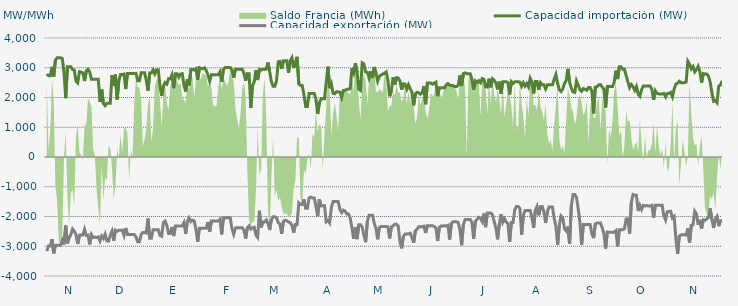
| Category | Capacidad importación (MW) | Capacidad exportación (MW) |
|---|---|---|
| 0 | 2787.5 | -3162.5 |
| 1900-01-01 | 2733.333 | -2987.5 |
| 1900-01-02 | 2733.333 | -2987.5 |
| 1900-01-03 | 3029.167 | -2762.5 |
| 1900-01-04 | 2695.833 | -3239.583 |
| 1900-01-05 | 3258.333 | -2966.667 |
| 1900-01-06 | 3333.333 | -2966.667 |
| 1900-01-07 | 3333.333 | -2966.667 |
| 1900-01-08 | 3333.333 | -2966.667 |
| 1900-01-09 | 3312.5 | -2793.75 |
| 1900-01-10 | 2843.75 | -2937.5 |
| 1900-01-11 | 1977.083 | -2306.25 |
| 1900-01-12 | 3033.333 | -2904.167 |
| 1900-01-13 | 3033.333 | -2710.417 |
| 1900-01-14 | 3033.333 | -2608.333 |
| 1900-01-15 | 2939.583 | -2420.833 |
| 1900-01-16 | 2920.833 | -2495.833 |
| 1900-01-17 | 2550 | -2612.5 |
| 1900-01-18 | 2491.667 | -2922.917 |
| 1900-01-19 | 2866.667 | -2629.167 |
| 1900-01-20 | 2854.167 | -2618.75 |
| 1900-01-21 | 2825 | -2622.917 |
| 1900-01-22 | 2554.167 | -2429.167 |
| 1900-01-23 | 2891.667 | -2635.417 |
| 1900-01-24 | 2950 | -2622.917 |
| 1900-01-25 | 2858.333 | -2937.5 |
| 1900-01-26 | 2616.667 | -2608.333 |
| 1900-01-27 | 2616.667 | -2708.333 |
| 1900-01-28 | 2616.667 | -2691.667 |
| 1900-01-29 | 2616.667 | -2708.333 |
| 1900-01-30 | 2616.667 | -2683.333 |
| 1900-01-31 | 1850 | -2820.833 |
| 1900-02-01 | 2268.75 | -2658.333 |
| 1900-02-02 | 1795.833 | -2741.667 |
| 1900-02-03 | 1725 | -2595.833 |
| 1900-02-04 | 1808.333 | -2825 |
| 1900-02-05 | 1808.333 | -2829.167 |
| 1900-02-06 | 1808.333 | -2622.917 |
| 1900-02-07 | 2750 | -2491.667 |
| 1900-02-08 | 2385.417 | -2816.667 |
| 1900-02-09 | 2770.833 | -2458.333 |
| 1900-02-10 | 1937.5 | -2495.833 |
| 1900-02-11 | 2562.5 | -2458.333 |
| 1900-02-12 | 2770.833 | -2458.333 |
| 1900-02-13 | 2770.833 | -2458.333 |
| 1900-02-14 | 2787.5 | -2637.5 |
| 1900-02-15 | 2283.333 | -2387.5 |
| 1900-02-16 | 2808.333 | -2606.25 |
| 1900-02-17 | 2808.333 | -2606.25 |
| 1900-02-18 | 2808.333 | -2606.25 |
| 1900-02-19 | 2808.333 | -2606.25 |
| 1900-02-20 | 2808.333 | -2606.25 |
| 1900-02-21 | 2812.5 | -2687.5 |
| 1900-02-22 | 2562.5 | -2847.917 |
| 1900-02-23 | 2562.5 | -2847.917 |
| 1900-02-24 | 2833.333 | -2606.25 |
| 1900-02-25 | 2833.333 | -2535.417 |
| 1900-02-26 | 2833.333 | -2535.417 |
| 1900-02-27 | 2587.5 | -2556.25 |
| 1900-02-28 | 2229.167 | -2068.75 |
| 1900-02-28 | 2825 | -2729.167 |
| 1900-03-01 | 2825 | -2729.167 |
| 1900-03-02 | 2933.333 | -2441.667 |
| 1900-03-03 | 2795.833 | -2441.667 |
| 1900-03-04 | 2933.333 | -2441.667 |
| 1900-03-05 | 2933.333 | -2441.667 |
| 1900-03-06 | 2397.917 | -2637.5 |
| 1900-03-07 | 2056.25 | -2662.5 |
| 1900-03-08 | 2383.333 | -2202.083 |
| 1900-03-09 | 2500 | -2154.167 |
| 1900-03-10 | 2450 | -2293.75 |
| 1900-03-11 | 2633.333 | -2570.833 |
| 1900-03-12 | 2633.333 | -2570.833 |
| 1900-03-13 | 2762.5 | -2352.083 |
| 1900-03-14 | 2312.5 | -2656.25 |
| 1900-03-15 | 2800 | -2322.917 |
| 1900-03-16 | 2800 | -2322.917 |
| 1900-03-17 | 2683.333 | -2322.917 |
| 1900-03-18 | 2787.5 | -2322.917 |
| 1900-03-19 | 2800 | -2322.917 |
| 1900-03-20 | 2412.5 | -2206.25 |
| 1900-03-21 | 2200 | -2575 |
| 1900-03-22 | 2616.667 | -2170.833 |
| 1900-03-23 | 2404.167 | -2045.833 |
| 1900-03-24 | 2937.5 | -2170.833 |
| 1900-03-25 | 2941.667 | -2125 |
| 1900-03-26 | 2925 | -2145.833 |
| 1900-03-27 | 2968.75 | -2437.5 |
| 1900-03-28 | 2593.75 | -2854.167 |
| 1900-03-29 | 3000 | -2395.833 |
| 1900-03-30 | 2979.167 | -2395.833 |
| 1900-03-31 | 2964.583 | -2395.833 |
| 1900-04-01 | 3000 | -2395.833 |
| 1900-04-02 | 2906.25 | -2395.833 |
| 1900-04-03 | 2750 | -2187.5 |
| 1900-04-04 | 2550 | -2512.5 |
| 1900-04-05 | 2766.667 | -2154.167 |
| 1900-04-06 | 2766.667 | -2154.167 |
| 1900-04-07 | 2766.667 | -2154.167 |
| 1900-04-08 | 2766.667 | -2154.167 |
| 1900-04-09 | 2766.667 | -2154.167 |
| 1900-04-10 | 2862.5 | -2093.75 |
| 1900-04-11 | 2529.167 | -2604.167 |
| 1900-04-12 | 2945.833 | -2041.667 |
| 1900-04-13 | 3008.333 | -2041.667 |
| 1900-04-14 | 3008.333 | -2041.667 |
| 1900-04-15 | 3008.333 | -2041.667 |
| 1900-04-16 | 3008.333 | -2041.667 |
| 1900-04-17 | 2922.917 | -2412.5 |
| 1900-04-18 | 2662.5 | -2600 |
| 1900-04-19 | 2945.833 | -2389.583 |
| 1900-04-20 | 2945.833 | -2377.083 |
| 1900-04-21 | 2945.833 | -2377.083 |
| 1900-04-22 | 2945.833 | -2377.083 |
| 1900-04-23 | 2945.833 | -2379.167 |
| 1900-04-24 | 2812.5 | -2462.5 |
| 1900-04-25 | 2562.5 | -2741.667 |
| 1900-04-26 | 2802.083 | -2377.083 |
| 1900-04-27 | 2800 | -2312.5 |
| 1900-04-28 | 1650 | -2420.833 |
| 1900-04-29 | 2400 | -2379.167 |
| 1900-04-30 | 2533.333 | -2362.5 |
| 1900-05-01 | 2918.75 | -2622.917 |
| 1900-05-02 | 2587.5 | -2702.083 |
| 1900-05-03 | 2947.917 | -1808.333 |
| 1900-05-04 | 2922.917 | -2372.917 |
| 1900-05-05 | 2947.917 | -2181.25 |
| 1900-05-06 | 2947.917 | -2181.25 |
| 1900-05-07 | 2947.917 | -2114.583 |
| 1900-05-08 | 3175 | -2225 |
| 1900-05-09 | 2875 | -2454.167 |
| 1900-05-10 | 2535.417 | -2108.333 |
| 1900-05-11 | 2375 | -2012.5 |
| 1900-05-12 | 2375 | -2012.5 |
| 1900-05-13 | 2566.667 | -2043.75 |
| 1900-05-14 | 3200 | -2208.333 |
| 1900-05-15 | 3212.5 | -2250 |
| 1900-05-16 | 2962.5 | -2579.167 |
| 1900-05-17 | 3233.333 | -2166.667 |
| 1900-05-18 | 3233.333 | -2122.917 |
| 1900-05-19 | 3233.333 | -2145.833 |
| 1900-05-20 | 2829.167 | -2185.417 |
| 1900-05-21 | 3233.333 | -2208.333 |
| 1900-05-22 | 3337.5 | -2293.75 |
| 1900-05-23 | 2991.304 | -2541.304 |
| 1900-05-24 | 3183.333 | -2268.75 |
| 1900-05-25 | 3366.667 | -2268.75 |
| 1900-05-26 | 2454.583 | -1541.667 |
| 1900-05-27 | 2400 | -1600 |
| 1900-05-28 | 2400 | -1600 |
| 1900-05-29 | 2100 | -1425 |
| 1900-05-30 | 1700 | -1725 |
| 1900-05-31 | 1700 | -1725 |
| 1900-06-01 | 2133.333 | -1375 |
| 1900-06-02 | 2133.333 | -1350 |
| 1900-06-03 | 2133.333 | -1375 |
| 1900-06-04 | 2133.333 | -1375 |
| 1900-06-05 | 1943.75 | -1662.5 |
| 1900-06-06 | 1447.917 | -1991.667 |
| 1900-06-07 | 1820.833 | -1420.833 |
| 1900-06-08 | 1958.333 | -1645.833 |
| 1900-06-09 | 1958.333 | -1637.5 |
| 1900-06-10 | 1958.333 | -1637.5 |
| 1900-06-11 | 2502.083 | -2177.083 |
| 1900-06-12 | 3037.5 | -2129.167 |
| 1900-06-13 | 2312.5 | -2216.667 |
| 1900-06-14 | 2456.25 | -1702.083 |
| 1900-06-15 | 2141.667 | -1497.917 |
| 1900-06-16 | 2125 | -1497.917 |
| 1900-06-17 | 2191.667 | -1497.917 |
| 1900-06-18 | 2191.667 | -1497.917 |
| 1900-06-19 | 2175 | -1766.667 |
| 1900-06-20 | 1997.917 | -1870.833 |
| 1900-06-21 | 2233.333 | -1787.5 |
| 1900-06-22 | 2241.667 | -1818.75 |
| 1900-06-23 | 2275 | -1914.583 |
| 1900-06-24 | 2275 | -1914.583 |
| 1900-06-25 | 2304.167 | -2052.083 |
| 1900-06-26 | 2979.167 | -2385.417 |
| 1900-06-27 | 2825 | -2752.083 |
| 1900-06-28 | 3154.167 | -2358.333 |
| 1900-06-29 | 2850 | -2760.417 |
| 1900-06-30 | 2285.417 | -2275 |
| 1900-07-01 | 2239.583 | -2275 |
| 1900-07-02 | 3162.5 | -2358.333 |
| 1900-07-03 | 3127.083 | -2631.25 |
| 1900-07-04 | 2858.333 | -2862.5 |
| 1900-07-05 | 2841.667 | -2166.667 |
| 1900-07-06 | 2656.25 | -1956.25 |
| 1900-07-07 | 2883.333 | -1956.25 |
| 1900-07-08 | 2656.25 | -1956.25 |
| 1900-07-09 | 3025 | -2229.167 |
| 1900-07-10 | 2831.25 | -2393.75 |
| 1900-07-11 | 2550.625 | -2766.667 |
| 1900-07-12 | 2710.417 | -2368.75 |
| 1900-07-13 | 2754.167 | -2337.5 |
| 1900-07-14 | 2791.667 | -2337.5 |
| 1900-07-15 | 2808.333 | -2337.5 |
| 1900-07-16 | 2858.333 | -2337.5 |
| 1900-07-17 | 2581.25 | -2347.917 |
| 1900-07-18 | 2041.667 | -2737.5 |
| 1900-07-19 | 2218.75 | -2354.167 |
| 1900-07-20 | 2679.167 | -2320.833 |
| 1900-07-21 | 2427.083 | -2260.417 |
| 1900-07-22 | 2666.667 | -2260.417 |
| 1900-07-23 | 2654.167 | -2320.833 |
| 1900-07-24 | 2562.5 | -2837.5 |
| 1900-07-25 | 2264.583 | -3070.833 |
| 1900-07-26 | 2458.333 | -2672.917 |
| 1900-07-27 | 2454.167 | -2585.417 |
| 1900-07-28 | 2279.167 | -2585.417 |
| 1900-07-29 | 2431.25 | -2585.417 |
| 1900-07-30 | 2295.833 | -2562.5 |
| 1900-07-31 | 2181.25 | -2700 |
| 1900-08-01 | 1735.417 | -2883.333 |
| 1900-08-02 | 2125 | -2487.5 |
| 1900-08-03 | 2170.833 | -2429.167 |
| 1900-08-04 | 2158.333 | -2341.667 |
| 1900-08-05 | 2112.5 | -2341.667 |
| 1900-08-06 | 2158.333 | -2341.667 |
| 1900-08-07 | 2383.333 | -2325 |
| 1900-08-08 | 1772.917 | -2554.167 |
| 1900-08-09 | 2485.417 | -2308.333 |
| 1900-08-10 | 2485.417 | -2308.333 |
| 1900-08-11 | 2485.417 | -2308.333 |
| 1900-08-12 | 2447.917 | -2308.333 |
| 1900-08-13 | 2485.417 | -2333.333 |
| 1900-08-14 | 2516.667 | -2387.5 |
| 1900-08-15 | 2043.75 | -2822.917 |
| 1900-08-16 | 2331.25 | -2362.5 |
| 1900-08-17 | 2331.25 | -2320.833 |
| 1900-08-18 | 2331.25 | -2320.833 |
| 1900-08-19 | 2318.75 | -2308.333 |
| 1900-08-20 | 2425 | -2320.833 |
| 1900-08-21 | 2468.75 | -2295.833 |
| 1900-08-22 | 2418.75 | -2772.917 |
| 1900-08-23 | 2400 | -2235.417 |
| 1900-08-24 | 2400 | -2179.167 |
| 1900-08-25 | 2366.667 | -2179.167 |
| 1900-08-26 | 2366.667 | -2179.167 |
| 1900-08-27 | 2404.167 | -2200 |
| 1900-08-28 | 2743.75 | -2437.5 |
| 1900-08-29 | 2393.75 | -2964.583 |
| 1900-08-30 | 2804.167 | -2270.833 |
| 1900-08-31 | 2829.167 | -2097.917 |
| 1900-09-01 | 2800 | -2097.917 |
| 1900-09-02 | 2800 | -2097.917 |
| 1900-09-03 | 2800 | -2097.917 |
| 1900-09-04 | 2610.417 | -2200 |
| 1900-09-05 | 2264.583 | -2750 |
| 1900-09-06 | 2556.25 | -2166.667 |
| 1900-09-07 | 2506.25 | -2095.833 |
| 1900-09-08 | 2564.583 | -2029.167 |
| 1900-09-09 | 2497.917 | -2058.333 |
| 1900-09-10 | 2635.417 | -2166.667 |
| 1900-09-11 | 2612.5 | -1900 |
| 1900-09-12 | 2362.5 | -2358.333 |
| 1900-09-13 | 2350 | -1885.417 |
| 1900-09-14 | 2633.333 | -1885.417 |
| 1900-09-15 | 2341.667 | -1885.417 |
| 1900-09-16 | 2633.333 | -1943.75 |
| 1900-09-17 | 2579.167 | -2168.75 |
| 1900-09-18 | 2485.417 | -2400 |
| 1900-09-19 | 2275 | -2766.667 |
| 1900-09-20 | 2533.333 | -2252.083 |
| 1900-09-21 | 2125 | -1929.167 |
| 1900-09-22 | 2533.333 | -2195.833 |
| 1900-09-23 | 2533.333 | -2072.917 |
| 1900-09-24 | 2533.333 | -2187.5 |
| 1900-09-25 | 2500 | -2237.5 |
| 1900-09-26 | 2100 | -2856.25 |
| 1900-09-27 | 2533.333 | -2202.083 |
| 1900-09-28 | 2475 | -2202.083 |
| 1900-09-29 | 2533.333 | -1768.75 |
| 1900-09-30 | 2533.333 | -1662.5 |
| 1900-10-01 | 2533.333 | -1662.5 |
| 1900-10-02 | 2518.75 | -1725 |
| 1900-10-03 | 2375 | -2614.583 |
| 1900-10-04 | 2495.833 | -1964.583 |
| 1900-10-05 | 2383.333 | -1800 |
| 1900-10-06 | 2466.667 | -1800 |
| 1900-10-07 | 2358.333 | -1800 |
| 1900-10-08 | 2650 | -1800 |
| 1900-10-09 | 2525 | -2037.5 |
| 1900-10-10 | 2135.417 | -2381.25 |
| 1900-10-11 | 2537.5 | -1800 |
| 1900-10-12 | 2537.5 | -1662.5 |
| 1900-10-13 | 2260.417 | -1960.417 |
| 1900-10-14 | 2500 | -1662.5 |
| 1900-10-15 | 2425 | -1662.5 |
| 1900-10-16 | 2425 | -1843.75 |
| 1900-10-17 | 2287.5 | -2216.667 |
| 1900-10-18 | 2425 | -1843.75 |
| 1900-10-19 | 2425 | -1681.25 |
| 1900-10-20 | 2425 | -1681.25 |
| 1900-10-21 | 2425 | -1681.25 |
| 1900-10-22 | 2616.667 | -2062.5 |
| 1900-10-23 | 2775 | -2329.167 |
| 1900-10-24 | 2475 | -2956.25 |
| 1900-10-25 | 2258.333 | -2293.75 |
| 1900-10-26 | 2200 | -1981.25 |
| 1900-10-27 | 2283.333 | -2043.75 |
| 1900-10-28 | 2466.667 | -2410.417 |
| 1900-10-29 | 2570.833 | -2485.417 |
| 1900-10-30 | 2962.5 | -2341.667 |
| 1900-10-31 | 2512.5 | -2920.833 |
| 1900-11-01 | 2308.333 | -1650 |
| 1900-11-02 | 2187.5 | -1262.5 |
| 1900-11-03 | 2170.833 | -1262.5 |
| 1900-11-04 | 2558.333 | -1352.083 |
| 1900-11-05 | 2416.667 | -1731.25 |
| 1900-11-06 | 2266.667 | -2175 |
| 1900-11-07 | 2208.333 | -2956.25 |
| 1900-11-08 | 2300 | -2268.75 |
| 1900-11-09 | 2275 | -2266.667 |
| 1900-11-10 | 2241.667 | -2266.667 |
| 1900-11-11 | 2333.333 | -2266.667 |
| 1900-11-12 | 2333.333 | -2270.833 |
| 1900-11-13 | 2212.5 | -2581.25 |
| 1900-11-14 | 1464.583 | -2725 |
| 1900-11-15 | 2350 | -2250 |
| 1900-11-16 | 2358.333 | -2218.75 |
| 1900-11-17 | 2425 | -2218.75 |
| 1900-11-18 | 2433.333 | -2218.75 |
| 1900-11-19 | 2354.167 | -2368.75 |
| 1900-11-20 | 2279.167 | -2575 |
| 1900-11-21 | 1662.5 | -3079.167 |
| 1900-11-22 | 2366.667 | -2522.917 |
| 1900-11-23 | 2366.667 | -2527.083 |
| 1900-11-24 | 2366.667 | -2527.083 |
| 1900-11-25 | 2366.667 | -2527.083 |
| 1900-11-26 | 2508.333 | -2527.083 |
| 1900-11-27 | 2900 | -2477.083 |
| 1900-11-28 | 2620.833 | -3004.167 |
| 1900-11-29 | 3033.333 | -2443.75 |
| 1900-11-30 | 3033.333 | -2443.75 |
| 1900-12-01 | 2950 | -2443.75 |
| 1900-12-02 | 2950 | -2410.417 |
| 1900-12-03 | 2735.417 | -2081.25 |
| 1900-12-04 | 2525 | -2075 |
| 1900-12-05 | 2332.667 | -2579.167 |
| 1900-12-06 | 2437.5 | -1537.5 |
| 1900-12-07 | 2366.667 | -1262.5 |
| 1900-12-08 | 2241.667 | -1287.5 |
| 1900-12-09 | 2366.667 | -1287.5 |
| 1900-12-10 | 2108.333 | -1814.583 |
| 1900-12-11 | 2039.583 | -1625 |
| 1900-12-12 | 2264.583 | -1762.5 |
| 1900-12-13 | 2383.333 | -1625 |
| 1900-12-14 | 2383.333 | -1650 |
| 1900-12-15 | 2383.333 | -1629.167 |
| 1900-12-16 | 2383.333 | -1650 |
| 1900-12-17 | 2383.333 | -1650 |
| 1900-12-18 | 2275 | -1625 |
| 1900-12-19 | 1918.75 | -2037.5 |
| 1900-12-20 | 2225 | -1625 |
| 1900-12-21 | 2138.417 | -1625 |
| 1900-12-22 | 2120.833 | -1625 |
| 1900-12-23 | 2120.833 | -1625 |
| 1900-12-24 | 2120.833 | -1625 |
| 1900-12-25 | 2137.5 | -1975 |
| 1900-12-26 | 2020 | -2116 |
| 1900-12-27 | 2137.5 | -1841.667 |
| 1900-12-28 | 2137.5 | -1825 |
| 1900-12-29 | 2170.833 | -1825 |
| 1900-12-30 | 2022.917 | -2054.167 |
| 1900-12-31 | 2287.5 | -2000 |
| 1901-01-01 | 2445.833 | -2731.25 |
| 1901-01-02 | 2481.25 | -3254.167 |
| 1901-01-03 | 2547.917 | -2662.5 |
| 1901-01-04 | 2500 | -2616.667 |
| 1901-01-05 | 2500 | -2616.667 |
| 1901-01-06 | 2500 | -2616.667 |
| 1901-01-07 | 2520.833 | -2620.833 |
| 1901-01-08 | 3218.75 | -2393.75 |
| 1901-01-09 | 3120.833 | -2885.417 |
| 1901-01-10 | 2966.667 | -2295.833 |
| 1901-01-11 | 3041.667 | -2281.25 |
| 1901-01-12 | 2862.5 | -1822.917 |
| 1901-01-13 | 2933.333 | -1914.583 |
| 1901-01-14 | 3050 | -2281.25 |
| 1901-01-15 | 2875 | -2112.5 |
| 1901-01-16 | 2500 | -2410.417 |
| 1901-01-17 | 2804.167 | -2112.5 |
| 1901-01-18 | 2791.667 | -2125 |
| 1901-01-19 | 2791.667 | -2083.333 |
| 1901-01-20 | 2716.667 | -2031.25 |
| 1901-01-21 | 2529.167 | -1727.083 |
| 1901-01-22 | 2162.5 | -2085.417 |
| 1901-01-23 | 1872.917 | -2385.417 |
| 1901-01-24 | 1897.917 | -2095.833 |
| 1901-01-25 | 1825 | -2002.083 |
| 1901-01-26 | 2383.333 | -2325 |
| 1901-01-27 | 2418.75 | -2145.833 |
| 1901-01-28 | 2558.333 | -2145.833 |